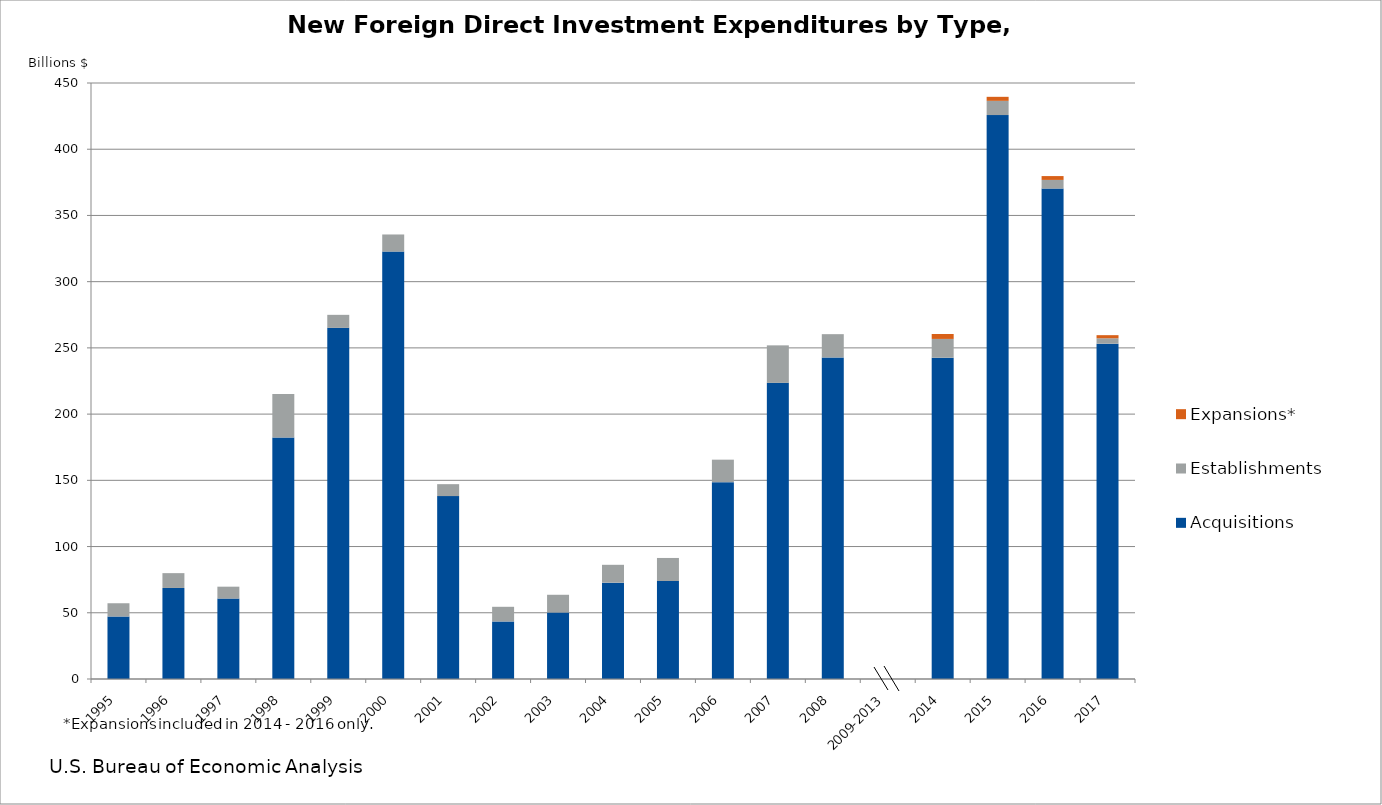
| Category | Acquisitions | Establishments | Expansions* |
|---|---|---|---|
| 1995 | 47.179 | 10.016 | 0 |
| 1996 | 68.733 | 11.196 | 0 |
| 1997 | 60.733 | 8.974 | 0 |
| 1998 | 182.357 | 32.899 | 0 |
| 1999 | 265.127 | 9.829 | 0 |
| 2000 | 322.703 | 12.926 | 0 |
| 2001 | 138.091 | 9.017 | 0 |
| 2002 | 43.442 | 11.077 | 0 |
| 2003 | 50.212 | 13.379 | 0 |
| 2004 | 72.738 | 13.481 | 0 |
| 2005 | 73.997 | 17.393 | 0 |
| 2006 | 148.604 | 16.999 | 0 |
| 2007 | 223.616 | 28.301 | 0 |
| 2008 | 242.799 | 17.564 | 0 |
| 2009-2013 | 0 | 0 | 0 |
| 2014 | 242.58 | 14.183 | 3.724 |
| 2015 | 425.788 | 10.739 | 3.037 |
| 2016 | 370.317 | 6.504 | 2.907 |
| 2017 | 253.171 | 4.075 | 2.361 |